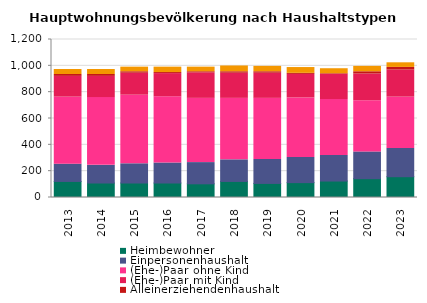
| Category | Heimbewohner | Einpersonenhaushalt | (Ehe-)Paar ohne Kind | (Ehe-)Paar mit Kind | Alleinerziehendenhaushalt | sonstiger Mehrpersonenhaushalt |
|---|---|---|---|---|---|---|
| 2013.0 | 122 | 131 | 509 | 158 | 14 | 38 |
| 2014.0 | 110 | 134 | 515 | 161 | 14 | 38 |
| 2015.0 | 110 | 146 | 521 | 167 | 11 | 35 |
| 2016.0 | 110 | 152 | 503 | 176 | 8 | 41 |
| 2017.0 | 104 | 161 | 488 | 194 | 8 | 35 |
| 2018.0 | 122 | 164 | 467 | 191 | 11 | 44 |
| 2019.0 | 107 | 182 | 464 | 191 | 11 | 41 |
| 2020.0 | 113 | 191 | 452 | 179 | 8 | 44 |
| 2021.0 | 125 | 194 | 425 | 191 | 5 | 38 |
| 2022.0 | 143 | 203 | 389 | 203 | 17 | 41 |
| 2023.0 | 158 | 215 | 389 | 206 | 20 | 35 |